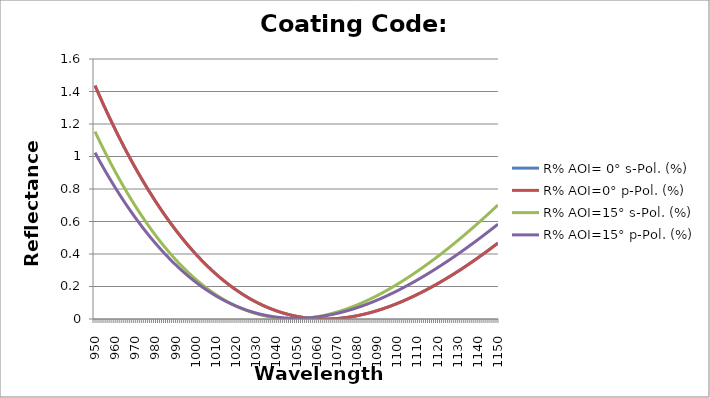
| Category | R% AOI= 0° s-Pol. (%) | R% AOI=0° p-Pol. (%) | R% AOI=15° s-Pol. (%) | R% AOI=15° p-Pol. (%) |
|---|---|---|---|---|
| 950.0 | 1.436 | 1.436 | 1.153 | 1.024 |
| 951.0 | 1.408 | 1.408 | 1.127 | 1.001 |
| 952.0 | 1.38 | 1.38 | 1.101 | 0.978 |
| 953.0 | 1.352 | 1.352 | 1.076 | 0.956 |
| 954.0 | 1.325 | 1.325 | 1.051 | 0.934 |
| 955.0 | 1.298 | 1.298 | 1.026 | 0.913 |
| 956.0 | 1.271 | 1.271 | 1.002 | 0.891 |
| 957.0 | 1.244 | 1.244 | 0.978 | 0.87 |
| 958.0 | 1.218 | 1.218 | 0.954 | 0.85 |
| 959.0 | 1.193 | 1.193 | 0.93 | 0.829 |
| 960.0 | 1.167 | 1.167 | 0.908 | 0.809 |
| 961.0 | 1.142 | 1.142 | 0.885 | 0.789 |
| 962.0 | 1.117 | 1.117 | 0.862 | 0.77 |
| 963.0 | 1.093 | 1.093 | 0.84 | 0.75 |
| 964.0 | 1.069 | 1.069 | 0.819 | 0.732 |
| 965.0 | 1.045 | 1.045 | 0.797 | 0.713 |
| 966.0 | 1.022 | 1.022 | 0.776 | 0.694 |
| 967.0 | 0.998 | 0.998 | 0.756 | 0.676 |
| 968.0 | 0.975 | 0.975 | 0.735 | 0.658 |
| 969.0 | 0.953 | 0.953 | 0.715 | 0.641 |
| 970.0 | 0.931 | 0.931 | 0.696 | 0.624 |
| 971.0 | 0.909 | 0.909 | 0.676 | 0.607 |
| 972.0 | 0.887 | 0.887 | 0.657 | 0.59 |
| 973.0 | 0.866 | 0.866 | 0.638 | 0.574 |
| 974.0 | 0.845 | 0.845 | 0.62 | 0.557 |
| 975.0 | 0.824 | 0.824 | 0.602 | 0.541 |
| 976.0 | 0.804 | 0.804 | 0.584 | 0.526 |
| 977.0 | 0.783 | 0.783 | 0.566 | 0.51 |
| 978.0 | 0.764 | 0.764 | 0.549 | 0.495 |
| 979.0 | 0.744 | 0.744 | 0.532 | 0.48 |
| 980.0 | 0.725 | 0.725 | 0.516 | 0.466 |
| 981.0 | 0.706 | 0.706 | 0.499 | 0.452 |
| 982.0 | 0.687 | 0.687 | 0.483 | 0.438 |
| 983.0 | 0.669 | 0.669 | 0.468 | 0.424 |
| 984.0 | 0.651 | 0.651 | 0.452 | 0.41 |
| 985.0 | 0.633 | 0.633 | 0.437 | 0.397 |
| 986.0 | 0.616 | 0.616 | 0.422 | 0.384 |
| 987.0 | 0.598 | 0.598 | 0.408 | 0.371 |
| 988.0 | 0.581 | 0.581 | 0.393 | 0.358 |
| 989.0 | 0.565 | 0.565 | 0.379 | 0.346 |
| 990.0 | 0.548 | 0.548 | 0.366 | 0.334 |
| 991.0 | 0.532 | 0.532 | 0.352 | 0.322 |
| 992.0 | 0.516 | 0.516 | 0.339 | 0.311 |
| 993.0 | 0.501 | 0.501 | 0.326 | 0.299 |
| 994.0 | 0.486 | 0.486 | 0.314 | 0.288 |
| 995.0 | 0.471 | 0.471 | 0.302 | 0.278 |
| 996.0 | 0.456 | 0.456 | 0.29 | 0.267 |
| 997.0 | 0.441 | 0.441 | 0.278 | 0.256 |
| 998.0 | 0.427 | 0.427 | 0.266 | 0.246 |
| 999.0 | 0.413 | 0.413 | 0.255 | 0.236 |
| 1000.0 | 0.4 | 0.4 | 0.244 | 0.227 |
| 1001.0 | 0.386 | 0.386 | 0.234 | 0.217 |
| 1002.0 | 0.373 | 0.373 | 0.223 | 0.208 |
| 1003.0 | 0.36 | 0.36 | 0.213 | 0.199 |
| 1004.0 | 0.348 | 0.348 | 0.203 | 0.19 |
| 1005.0 | 0.335 | 0.335 | 0.194 | 0.182 |
| 1006.0 | 0.323 | 0.323 | 0.184 | 0.174 |
| 1007.0 | 0.311 | 0.311 | 0.175 | 0.166 |
| 1008.0 | 0.3 | 0.3 | 0.166 | 0.158 |
| 1009.0 | 0.288 | 0.288 | 0.158 | 0.15 |
| 1010.0 | 0.277 | 0.277 | 0.15 | 0.142 |
| 1011.0 | 0.266 | 0.266 | 0.142 | 0.135 |
| 1012.0 | 0.256 | 0.256 | 0.134 | 0.128 |
| 1013.0 | 0.245 | 0.245 | 0.126 | 0.121 |
| 1014.0 | 0.235 | 0.235 | 0.119 | 0.115 |
| 1015.0 | 0.225 | 0.225 | 0.112 | 0.108 |
| 1016.0 | 0.215 | 0.215 | 0.105 | 0.102 |
| 1017.0 | 0.206 | 0.206 | 0.098 | 0.096 |
| 1018.0 | 0.197 | 0.197 | 0.092 | 0.09 |
| 1019.0 | 0.188 | 0.188 | 0.086 | 0.085 |
| 1020.0 | 0.179 | 0.179 | 0.08 | 0.08 |
| 1021.0 | 0.171 | 0.171 | 0.074 | 0.074 |
| 1022.0 | 0.162 | 0.162 | 0.068 | 0.069 |
| 1023.0 | 0.154 | 0.154 | 0.063 | 0.065 |
| 1024.0 | 0.146 | 0.146 | 0.058 | 0.06 |
| 1025.0 | 0.139 | 0.139 | 0.053 | 0.056 |
| 1026.0 | 0.131 | 0.131 | 0.049 | 0.051 |
| 1027.0 | 0.124 | 0.124 | 0.044 | 0.047 |
| 1028.0 | 0.117 | 0.117 | 0.04 | 0.044 |
| 1029.0 | 0.111 | 0.111 | 0.036 | 0.04 |
| 1030.0 | 0.104 | 0.104 | 0.033 | 0.036 |
| 1031.0 | 0.098 | 0.098 | 0.029 | 0.033 |
| 1032.0 | 0.092 | 0.092 | 0.026 | 0.03 |
| 1033.0 | 0.086 | 0.086 | 0.023 | 0.027 |
| 1034.0 | 0.08 | 0.08 | 0.02 | 0.024 |
| 1035.0 | 0.075 | 0.075 | 0.017 | 0.022 |
| 1036.0 | 0.069 | 0.069 | 0.015 | 0.02 |
| 1037.0 | 0.064 | 0.064 | 0.013 | 0.017 |
| 1038.0 | 0.06 | 0.06 | 0.011 | 0.015 |
| 1039.0 | 0.055 | 0.055 | 0.009 | 0.014 |
| 1040.0 | 0.05 | 0.05 | 0.007 | 0.012 |
| 1041.0 | 0.046 | 0.046 | 0.006 | 0.01 |
| 1042.0 | 0.042 | 0.042 | 0.005 | 0.009 |
| 1043.0 | 0.038 | 0.038 | 0.004 | 0.008 |
| 1044.0 | 0.035 | 0.035 | 0.003 | 0.007 |
| 1045.0 | 0.031 | 0.031 | 0.002 | 0.006 |
| 1046.0 | 0.028 | 0.028 | 0.002 | 0.005 |
| 1047.0 | 0.025 | 0.025 | 0.001 | 0.005 |
| 1048.0 | 0.022 | 0.022 | 0.001 | 0.004 |
| 1049.0 | 0.019 | 0.019 | 0.001 | 0.004 |
| 1050.0 | 0.017 | 0.017 | 0.001 | 0.004 |
| 1051.0 | 0.014 | 0.014 | 0.002 | 0.004 |
| 1052.0 | 0.012 | 0.012 | 0.002 | 0.004 |
| 1053.0 | 0.01 | 0.01 | 0.003 | 0.005 |
| 1054.0 | 0.008 | 0.008 | 0.004 | 0.006 |
| 1055.0 | 0.007 | 0.007 | 0.005 | 0.006 |
| 1056.0 | 0.005 | 0.005 | 0.007 | 0.007 |
| 1057.0 | 0.004 | 0.004 | 0.008 | 0.008 |
| 1058.0 | 0.003 | 0.003 | 0.01 | 0.009 |
| 1059.0 | 0.002 | 0.002 | 0.012 | 0.01 |
| 1060.0 | 0.001 | 0.001 | 0.014 | 0.012 |
| 1061.0 | 0.001 | 0.001 | 0.016 | 0.014 |
| 1062.0 | 0 | 0 | 0.018 | 0.015 |
| 1063.0 | 0 | 0 | 0.021 | 0.017 |
| 1064.0 | 0 | 0 | 0.023 | 0.019 |
| 1065.0 | 0 | 0 | 0.026 | 0.021 |
| 1066.0 | 0 | 0 | 0.029 | 0.024 |
| 1067.0 | 0.001 | 0.001 | 0.032 | 0.026 |
| 1068.0 | 0.001 | 0.001 | 0.036 | 0.029 |
| 1069.0 | 0.002 | 0.002 | 0.039 | 0.031 |
| 1070.0 | 0.003 | 0.003 | 0.042 | 0.034 |
| 1071.0 | 0.004 | 0.004 | 0.046 | 0.037 |
| 1072.0 | 0.005 | 0.005 | 0.05 | 0.04 |
| 1073.0 | 0.006 | 0.006 | 0.054 | 0.043 |
| 1074.0 | 0.008 | 0.008 | 0.058 | 0.047 |
| 1075.0 | 0.01 | 0.01 | 0.063 | 0.05 |
| 1076.0 | 0.011 | 0.011 | 0.067 | 0.054 |
| 1077.0 | 0.013 | 0.013 | 0.072 | 0.057 |
| 1078.0 | 0.015 | 0.015 | 0.076 | 0.061 |
| 1079.0 | 0.018 | 0.018 | 0.081 | 0.065 |
| 1080.0 | 0.02 | 0.02 | 0.086 | 0.069 |
| 1081.0 | 0.022 | 0.022 | 0.092 | 0.073 |
| 1082.0 | 0.025 | 0.025 | 0.097 | 0.078 |
| 1083.0 | 0.028 | 0.028 | 0.102 | 0.082 |
| 1084.0 | 0.031 | 0.031 | 0.108 | 0.087 |
| 1085.0 | 0.034 | 0.034 | 0.114 | 0.091 |
| 1086.0 | 0.037 | 0.037 | 0.119 | 0.096 |
| 1087.0 | 0.04 | 0.04 | 0.125 | 0.101 |
| 1088.0 | 0.044 | 0.044 | 0.131 | 0.106 |
| 1089.0 | 0.048 | 0.048 | 0.138 | 0.111 |
| 1090.0 | 0.051 | 0.051 | 0.144 | 0.116 |
| 1091.0 | 0.055 | 0.055 | 0.15 | 0.121 |
| 1092.0 | 0.059 | 0.059 | 0.157 | 0.127 |
| 1093.0 | 0.063 | 0.063 | 0.164 | 0.132 |
| 1094.0 | 0.068 | 0.068 | 0.17 | 0.138 |
| 1095.0 | 0.072 | 0.072 | 0.177 | 0.144 |
| 1096.0 | 0.076 | 0.076 | 0.184 | 0.149 |
| 1097.0 | 0.081 | 0.081 | 0.192 | 0.155 |
| 1098.0 | 0.086 | 0.086 | 0.199 | 0.161 |
| 1099.0 | 0.091 | 0.091 | 0.206 | 0.167 |
| 1100.0 | 0.096 | 0.096 | 0.214 | 0.174 |
| 1101.0 | 0.101 | 0.101 | 0.221 | 0.18 |
| 1102.0 | 0.106 | 0.106 | 0.229 | 0.186 |
| 1103.0 | 0.111 | 0.111 | 0.237 | 0.193 |
| 1104.0 | 0.117 | 0.117 | 0.245 | 0.199 |
| 1105.0 | 0.122 | 0.122 | 0.253 | 0.206 |
| 1106.0 | 0.128 | 0.128 | 0.261 | 0.213 |
| 1107.0 | 0.134 | 0.134 | 0.269 | 0.22 |
| 1108.0 | 0.139 | 0.139 | 0.277 | 0.226 |
| 1109.0 | 0.145 | 0.145 | 0.286 | 0.234 |
| 1110.0 | 0.151 | 0.151 | 0.294 | 0.241 |
| 1111.0 | 0.157 | 0.157 | 0.303 | 0.248 |
| 1112.0 | 0.164 | 0.164 | 0.311 | 0.255 |
| 1113.0 | 0.17 | 0.17 | 0.32 | 0.262 |
| 1114.0 | 0.176 | 0.176 | 0.329 | 0.27 |
| 1115.0 | 0.183 | 0.183 | 0.338 | 0.277 |
| 1116.0 | 0.19 | 0.19 | 0.347 | 0.285 |
| 1117.0 | 0.196 | 0.196 | 0.356 | 0.292 |
| 1118.0 | 0.203 | 0.203 | 0.365 | 0.3 |
| 1119.0 | 0.21 | 0.21 | 0.374 | 0.308 |
| 1120.0 | 0.217 | 0.217 | 0.384 | 0.316 |
| 1121.0 | 0.224 | 0.224 | 0.393 | 0.324 |
| 1122.0 | 0.232 | 0.232 | 0.403 | 0.332 |
| 1123.0 | 0.239 | 0.239 | 0.413 | 0.34 |
| 1124.0 | 0.246 | 0.246 | 0.422 | 0.348 |
| 1125.0 | 0.254 | 0.254 | 0.432 | 0.356 |
| 1126.0 | 0.261 | 0.261 | 0.442 | 0.365 |
| 1127.0 | 0.269 | 0.269 | 0.452 | 0.373 |
| 1128.0 | 0.277 | 0.277 | 0.462 | 0.382 |
| 1129.0 | 0.284 | 0.284 | 0.472 | 0.39 |
| 1130.0 | 0.292 | 0.292 | 0.482 | 0.399 |
| 1131.0 | 0.3 | 0.3 | 0.493 | 0.407 |
| 1132.0 | 0.308 | 0.308 | 0.503 | 0.416 |
| 1133.0 | 0.317 | 0.317 | 0.514 | 0.425 |
| 1134.0 | 0.325 | 0.325 | 0.524 | 0.434 |
| 1135.0 | 0.333 | 0.333 | 0.535 | 0.443 |
| 1136.0 | 0.342 | 0.342 | 0.545 | 0.452 |
| 1137.0 | 0.35 | 0.35 | 0.556 | 0.461 |
| 1138.0 | 0.359 | 0.359 | 0.567 | 0.47 |
| 1139.0 | 0.368 | 0.368 | 0.578 | 0.479 |
| 1140.0 | 0.376 | 0.376 | 0.589 | 0.488 |
| 1141.0 | 0.385 | 0.385 | 0.6 | 0.497 |
| 1142.0 | 0.394 | 0.394 | 0.611 | 0.507 |
| 1143.0 | 0.403 | 0.403 | 0.622 | 0.516 |
| 1144.0 | 0.412 | 0.412 | 0.633 | 0.526 |
| 1145.0 | 0.421 | 0.421 | 0.645 | 0.535 |
| 1146.0 | 0.43 | 0.43 | 0.656 | 0.545 |
| 1147.0 | 0.439 | 0.439 | 0.667 | 0.554 |
| 1148.0 | 0.449 | 0.449 | 0.679 | 0.564 |
| 1149.0 | 0.458 | 0.458 | 0.69 | 0.574 |
| 1150.0 | 0.468 | 0.468 | 0.702 | 0.584 |